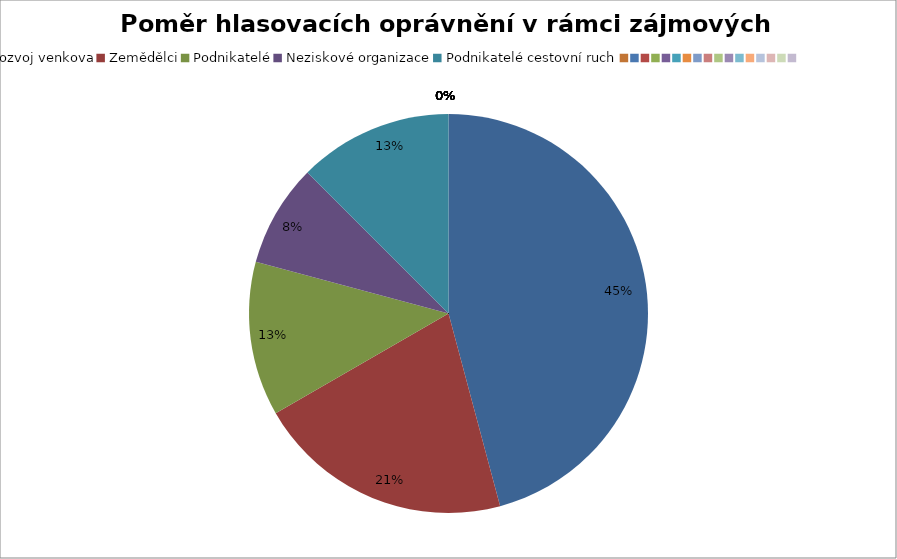
| Category | Series 0 |
|---|---|
| Rozvoj venkova | 0.458 |
| Zemědělci | 0.208 |
| Podnikatelé | 0.125 |
| Neziskové organizace | 0.083 |
| Podnikatelé cestovní ruch | 0.125 |